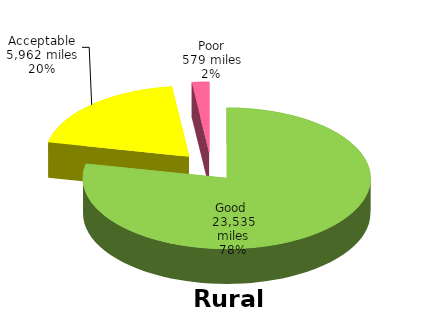
| Category | Rural |
|---|---|
| Good  | 23535 |
| Acceptable | 5962 |
| Poor | 579 |